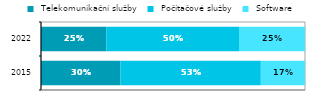
| Category |  Telekomunikační služby |  Počítačové služby |  Software |
|---|---|---|---|
|  2015 | 0.301 | 0.531 | 0.167 |
| 2022 | 0.247 | 0.503 | 0.25 |